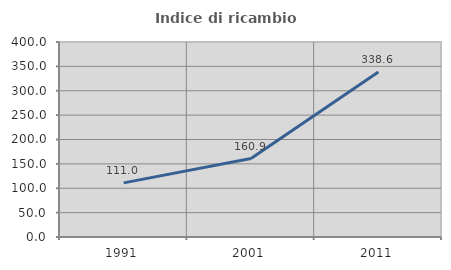
| Category | Indice di ricambio occupazionale  |
|---|---|
| 1991.0 | 110.976 |
| 2001.0 | 160.938 |
| 2011.0 | 338.596 |